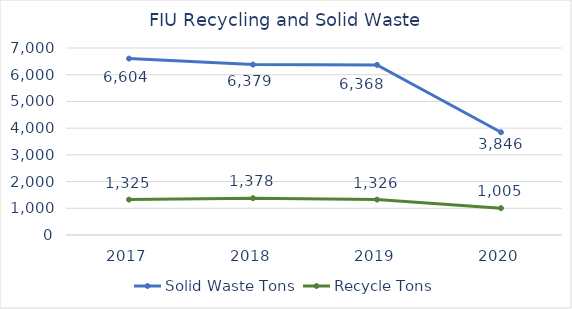
| Category | Solid Waste Tons | Recycle Tons |
|---|---|---|
| 2017.0 | 6604 | 1325 |
| 2018.0 | 6379 | 1378 |
| 2019.0 | 6368 | 1326 |
| 2020.0 | 3846 | 1005 |